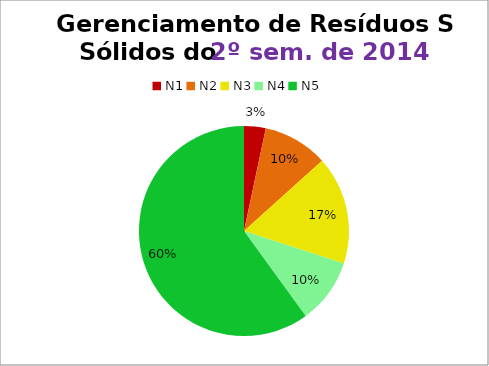
| Category | 2º/14 |
|---|---|
| N1 | 1 |
| N2 | 3 |
| N3 | 5 |
| N4 | 3 |
| N5 | 18 |